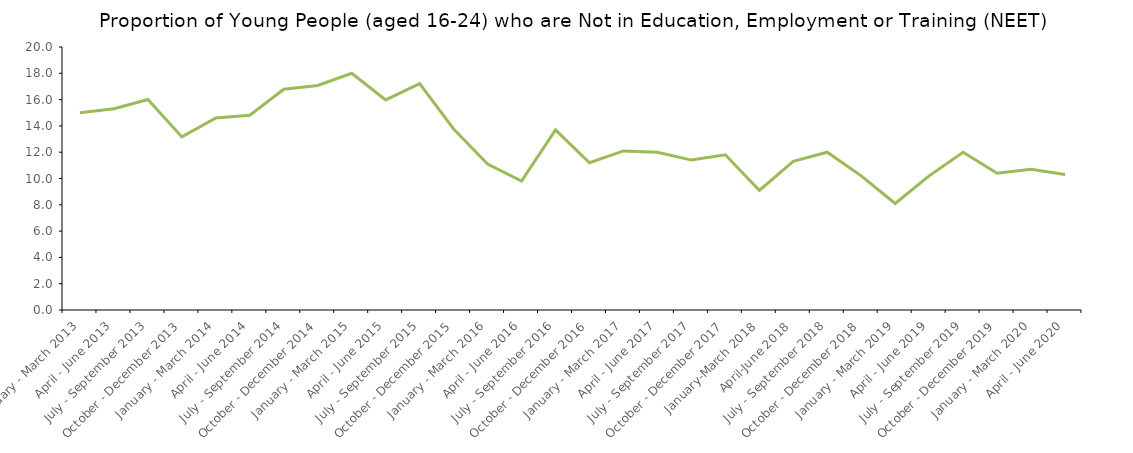
| Category | Series 2 |
|---|---|
| January - March 2013 | 15 |
| April - June 2013 | 15.3 |
| July - September 2013 | 16.006 |
| October - December 2013 | 13.163 |
| January - March 2014 | 14.6 |
| April - June 2014 | 14.811 |
| July - September 2014 | 16.785 |
| October - December 2014 | 17.073 |
| January - March 2015 | 18 |
| April - June 2015 | 15.972 |
| July - September 2015 | 17.216 |
| October - December 2015 | 13.765 |
| January - March 2016 | 11.1 |
| April - June 2016 | 9.8 |
| July - September 2016 | 13.7 |
| October - December 2016 | 11.2 |
| January - March 2017 | 12.1 |
| April - June 2017 | 12 |
| July - September 2017 | 11.4 |
| October - December 2017 | 11.8 |
| January-March 2018 | 9.1 |
| April-June 2018 | 11.3 |
| July - September 2018 | 12 |
| October - December 2018 | 10.2 |
| January - March 2019 | 8.1 |
| April - June 2019 | 10.2 |
| July - September 2019 | 12 |
| October - December 2019 | 10.4 |
| January - March 2020 | 10.7 |
| April - June 2020 | 10.3 |